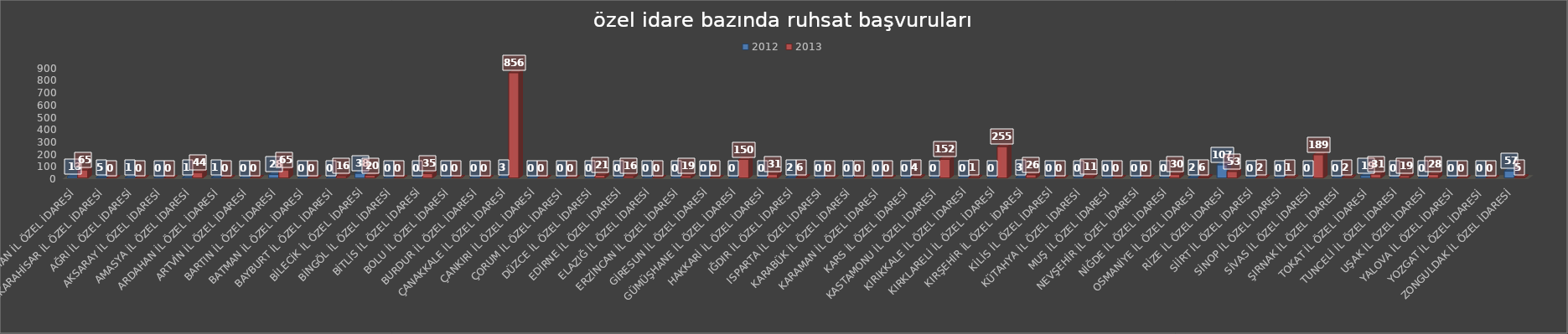
| Category | 2012 | 2013 |
|---|---|---|
| ADIYAMAN İL ÖZEL İDARESİ | 13 | 65 |
| AFYONKARAHİSAR İL ÖZEL İDARESİ | 5 | 0 |
| AĞRI İL ÖZEL İDARESİ | 1 | 0 |
| AKSARAY İL ÖZEL İDARESİ | 0 | 0 |
| AMASYA İL ÖZEL İDARESİ | 1 | 44 |
| ARDAHAN İL ÖZEL İDARESİ | 1 | 0 |
| ARTVİN İL ÖZEL İDARESİ | 0 | 0 |
| BARTIN İL ÖZEL İDARESİ | 28 | 65 |
| BATMAN İL ÖZEL İDARESİ | 0 | 0 |
| BAYBURT İL ÖZEL İDARESİ | 0 | 16 |
| BİLECİK İL ÖZEL İDARESİ | 38 | 20 |
| BİNGÖL İL ÖZEL İDARESİ | 0 | 0 |
| BİTLİS İL ÖZEL İDARESİ | 0 | 35 |
| BOLU İL ÖZEL İDARESİ | 0 | 0 |
| BURDUR İL ÖZEL İDARESİ | 0 | 0 |
| ÇANAKKALE İL ÖZEL İDARESİ | 3 | 856 |
| ÇANKIRI İL ÖZEL İDARESİ | 0 | 0 |
| ÇORUM İL ÖZEL İDARESİ | 0 | 0 |
| DÜZCE İL ÖZEL İDARESİ | 0 | 21 |
| EDİRNE İL ÖZEL İDARESİ | 0 | 16 |
| ELAZIĞ İL ÖZEL İDARESİ | 0 | 0 |
| ERZİNCAN İL ÖZEL İDARESİ | 0 | 19 |
| GİRESUN İL ÖZEL İDARESİ | 0 | 0 |
| GÜMÜŞHANE İL ÖZEL İDARESİ | 0 | 150 |
| HAKKARİ İL ÖZEL İDARESİ | 0 | 31 |
| IĞDIR İL ÖZEL İDARESİ | 2 | 6 |
| ISPARTA İL ÖZEL İDARESİ | 0 | 0 |
| KARABÜK İL ÖZEL İDARESİ | 0 | 0 |
| KARAMAN İL ÖZEL İDARESİ | 0 | 0 |
| KARS İL ÖZEL İDARESİ | 0 | 4 |
| KASTAMONU İL ÖZEL İDARESİ | 0 | 152 |
| KIRIKKALE İL ÖZEL İDARESİ | 0 | 1 |
| KIRKLARELİ İL ÖZEL İDARESİ | 0 | 255 |
| KIRŞEHİR İL ÖZEL İDARESİ | 3 | 26 |
| KİLİS İL ÖZEL İDARESİ | 0 | 0 |
| KÜTAHYA İL ÖZEL İDARESİ | 0 | 11 |
| MUŞ İL ÖZEL İDARESİ | 0 | 0 |
| NEVŞEHİR İL ÖZEL İDARESİ | 0 | 0 |
| NİĞDE İL ÖZEL İDARESİ | 0 | 30 |
| OSMANİYE İL ÖZEL İDARESİ | 2 | 6 |
| RİZE İL ÖZEL İDARESİ | 107 | 53 |
| SİİRT İL ÖZEL İDARESİ | 0 | 2 |
| SİNOP İL ÖZEL İDARESİ | 0 | 1 |
| SİVAS İL ÖZEL İDARESİ | 0 | 189 |
| ŞIRNAK İL ÖZEL İDARESİ | 0 | 2 |
| TOKAT İL ÖZEL İDARESİ | 19 | 31 |
| TUNCELİ İL ÖZEL İDARESİ | 0 | 19 |
| UŞAK İL ÖZEL İDARESİ | 0 | 28 |
| YALOVA İL ÖZEL İDARESİ | 0 | 0 |
| YOZGAT İL ÖZEL İDARESİ | 0 | 0 |
| ZONGULDAK İL ÖZEL İDARESİ | 57 | 5 |